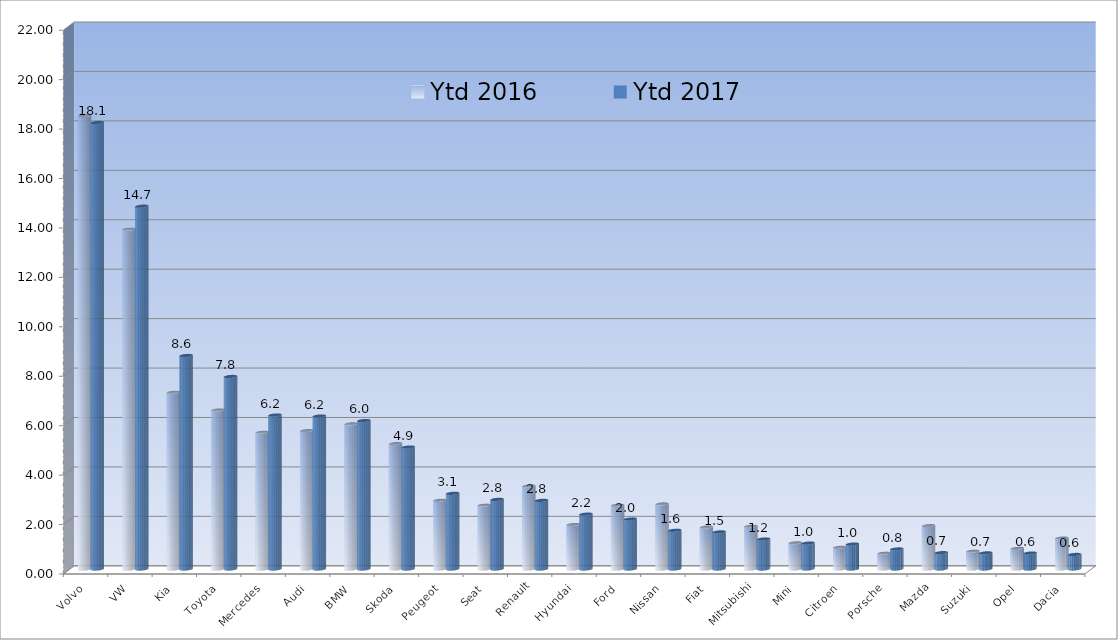
| Category | Ytd 2016 | Ytd 2017 |
|---|---|---|
| Volvo | 18.336 | 18.066 |
| VW | 13.747 | 14.678 |
| Kia | 7.149 | 8.637 |
| Toyota | 6.43 | 7.788 |
| Mercedes | 5.533 | 6.229 |
| Audi | 5.596 | 6.189 |
| BMW | 5.87 | 6.006 |
| Skoda | 5.073 | 4.935 |
| Peugeot | 2.778 | 3.061 |
| Seat | 2.582 | 2.816 |
| Renault | 3.355 | 2.775 |
| Hyundai | 1.799 | 2.219 |
| Ford | 2.579 | 2.023 |
| Nissan | 2.63 | 1.567 |
| Fiat | 1.696 | 1.501 |
| Mitsubishi | 1.73 | 1.213 |
| Mini | 1.058 | 1.048 |
| Citroen | 0.877 | 1.007 |
| Porsche | 0.639 | 0.811 |
| Mazda | 1.75 | 0.661 |
| Suzuki | 0.721 | 0.652 |
| Opel | 0.833 | 0.644 |
| Dacia | 1.249 | 0.588 |